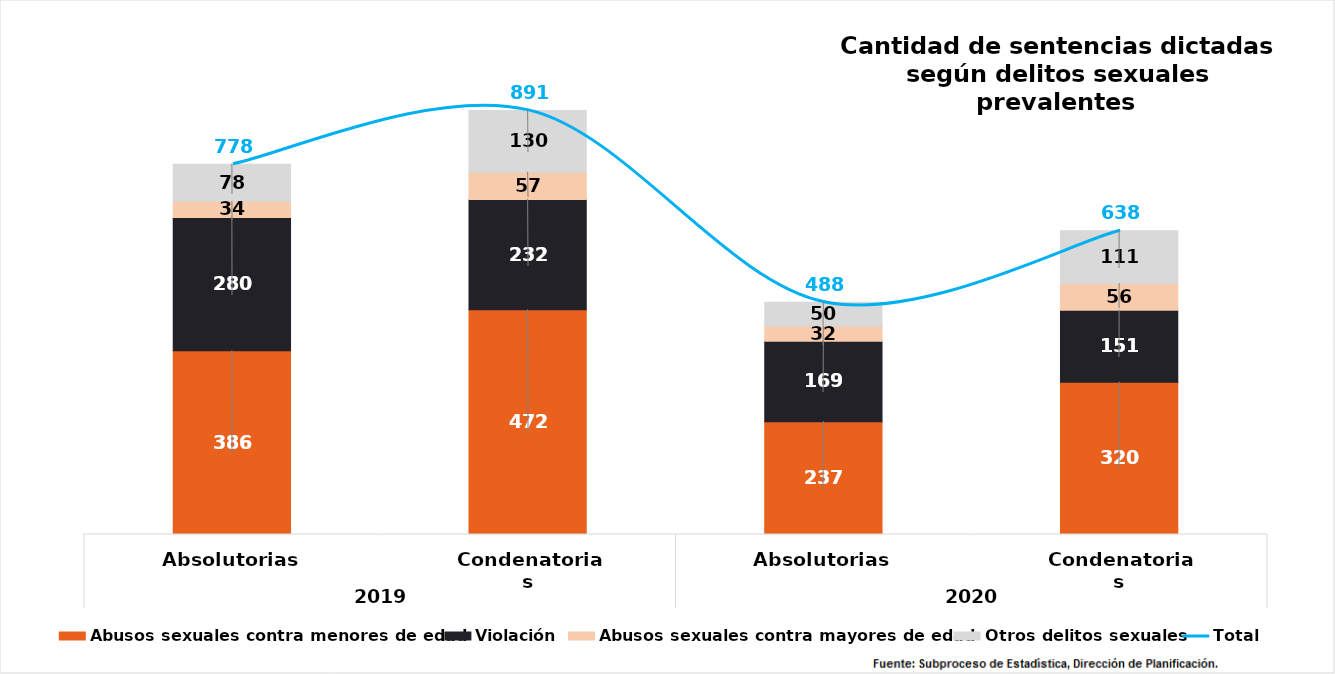
| Category | Abusos sexuales contra menores de edad | Violación | Abusos sexuales contra mayores de edad | Otros delitos sexuales |
|---|---|---|---|---|
| 0 | 386 | 280 | 34 | 78 |
| 1 | 472 | 232 | 57 | 130 |
| 2 | 237 | 169 | 32 | 50 |
| 3 | 320 | 151 | 56 | 111 |